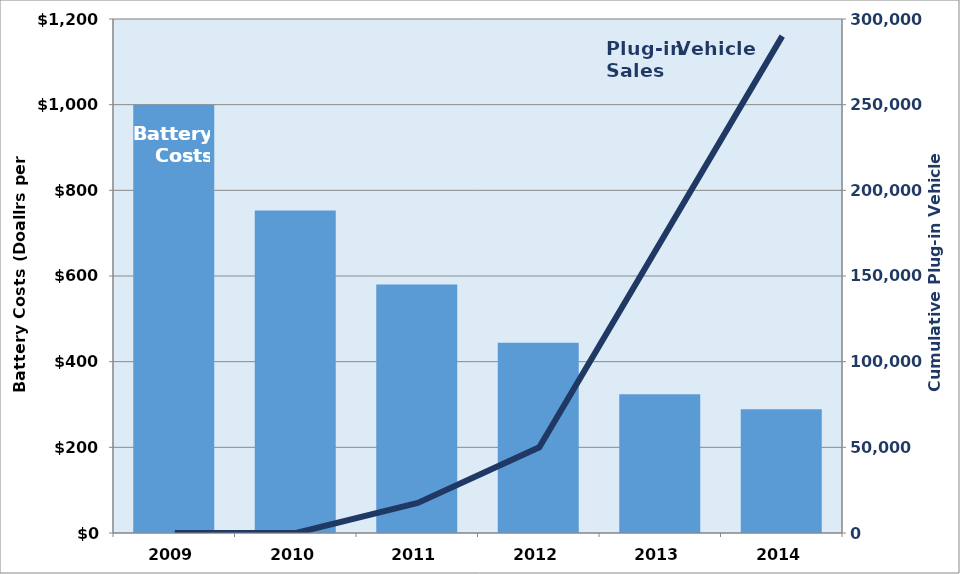
| Category | U.S. EV Battery Costs-($/kWh auto Li-ion battery) |
|---|---|
| 2009.0 | 1000 |
| 2010.0 | 753 |
| 2011.0 | 580 |
| 2012.0 | 444 |
| 2013.0 | 324 |
| 2014.0 | 289 |